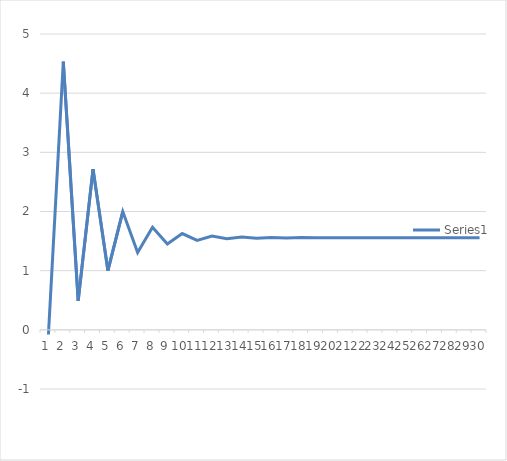
| Category | Series 0 |
|---|---|
| 0 | -0.079 |
| 1 | 4.533 |
| 2 | 0.489 |
| 3 | 2.716 |
| 4 | 1.001 |
| 5 | 1.999 |
| 6 | 1.307 |
| 7 | 1.732 |
| 8 | 1.451 |
| 9 | 1.628 |
| 10 | 1.513 |
| 11 | 1.586 |
| 12 | 1.539 |
| 13 | 1.569 |
| 14 | 1.55 |
| 15 | 1.562 |
| 16 | 1.554 |
| 17 | 1.559 |
| 18 | 1.556 |
| 19 | 1.558 |
| 20 | 1.557 |
| 21 | 1.557 |
| 22 | 1.557 |
| 23 | 1.557 |
| 24 | 1.557 |
| 25 | 1.557 |
| 26 | 1.557 |
| 27 | 1.557 |
| 28 | 1.557 |
| 29 | 1.557 |